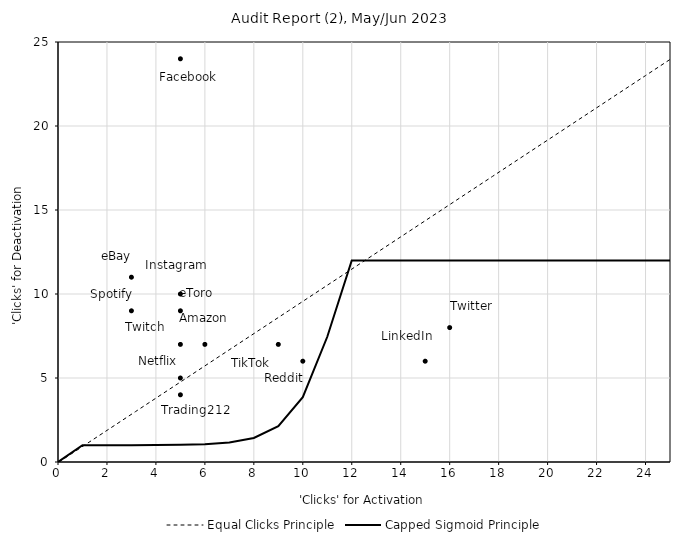
| Category | Equal Clicks Principle |
|---|---|
| 1.0 | 0 |